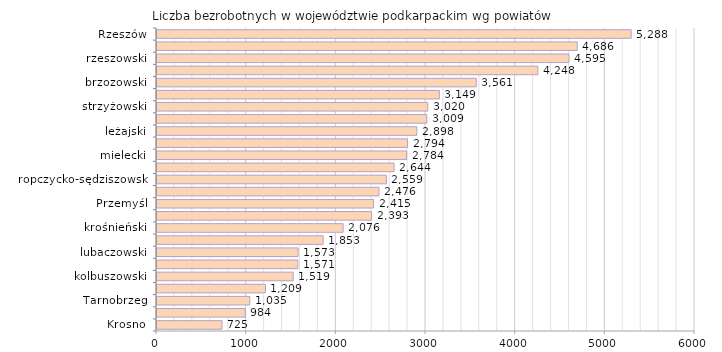
| Category | Liczba bezrobotnych w województwie podkarpackim wg powiatów |
|---|---|
| Krosno | 725 |
| bieszczadzki | 984 |
| Tarnobrzeg | 1035 |
| tarnobrzeski  | 1209 |
| kolbuszowski | 1519 |
| leski | 1571 |
| lubaczowski | 1573 |
| stalowowolski | 1853 |
| krośnieński | 2076 |
| dębicki | 2393 |
| Przemyśl | 2415 |
| łańcucki | 2476 |
| ropczycko-sędziszowski | 2559 |
| sanocki | 2644 |
| mielecki | 2784 |
| przemyski | 2794 |
| leżajski | 2898 |
| niżański | 3009 |
| strzyżowski | 3020 |
| przeworski | 3149 |
| brzozowski | 3561 |
| jarosławski | 4248 |
| rzeszowski | 4595 |
| jasielski | 4686 |
| Rzeszów | 5288 |